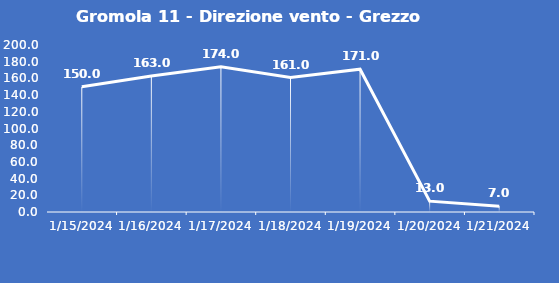
| Category | Gromola 11 - Direzione vento - Grezzo (°N) |
|---|---|
| 1/15/24 | 150 |
| 1/16/24 | 163 |
| 1/17/24 | 174 |
| 1/18/24 | 161 |
| 1/19/24 | 171 |
| 1/20/24 | 13 |
| 1/21/24 | 7 |